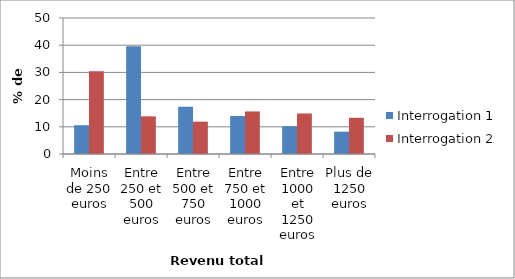
| Category | Interrogation 1 | Interrogation 2 |
|---|---|---|
| Moins de 250 euros | 10.58 | 30.42 |
| Entre 250 et 500 euros | 39.63 | 13.84 |
| Entre 500 et 750 euros | 17.38 | 11.9 |
| Entre 750 et 1000 euros | 13.98 | 15.65 |
| Entre 1000 et 1250 euros | 10.2 | 14.89 |
| Plus de 1250 euros | 8.21 | 13.31 |